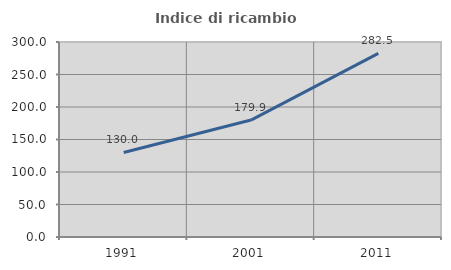
| Category | Indice di ricambio occupazionale  |
|---|---|
| 1991.0 | 130.035 |
| 2001.0 | 179.897 |
| 2011.0 | 282.456 |